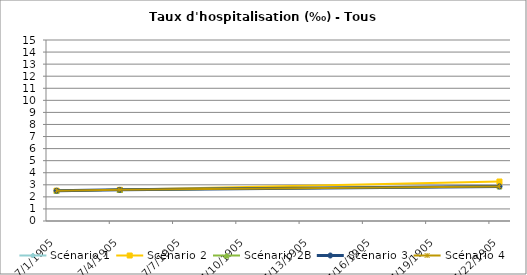
| Category | Scénario 1 | Scénario 2 | Scénario 2B | Scénario 3 | Scénario 4 |
|---|---|---|---|---|---|
| 2009.0 | 2.513 | 2.513 | 2.513 | 2.513 | 2.513 |
| 2012.0 | 2.581 | 2.581 | 2.581 | 2.581 | 2.581 |
| 2030.0 | 2.863 | 3.271 | 2.863 | 2.863 | 2.863 |